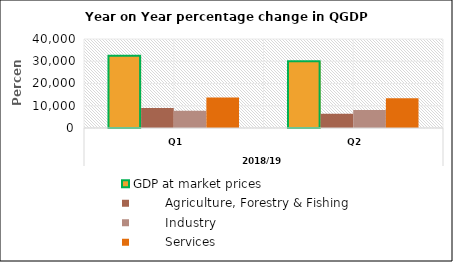
| Category | GDP at market prices |         Agriculture, Forestry & Fishing |         Industry |         Services |
|---|---|---|---|---|
| 0 | 32485.712 | 8973.299 | 7779.006 | 13754.581 |
| 1 | 29958.477 | 6448.255 | 8067.59 | 13369.634 |